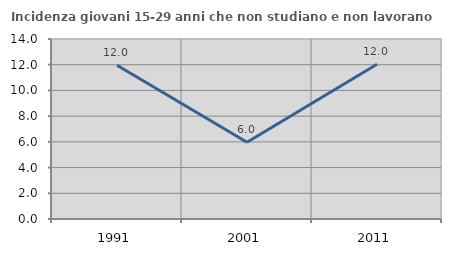
| Category | Incidenza giovani 15-29 anni che non studiano e non lavorano  |
|---|---|
| 1991.0 | 11.957 |
| 2001.0 | 5.969 |
| 2011.0 | 12.035 |